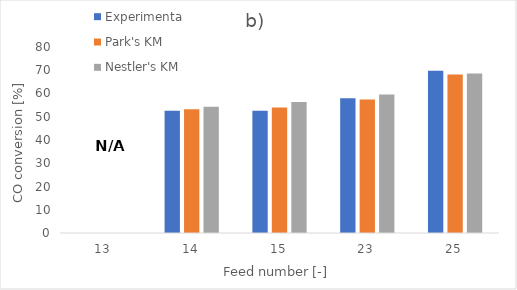
| Category | Experimental | Park's KM | Nestler's KM |
|---|---|---|---|
| 13.0 | 0 | 0 | 0 |
| 14.0 | 52.54 | 53.19 | 54.29 |
| 15.0 | 52.6 | 53.96 | 56.35 |
| 23.0 | 57.96 | 57.44 | 59.57 |
| 25.0 | 69.77 | 68.15 | 68.6 |